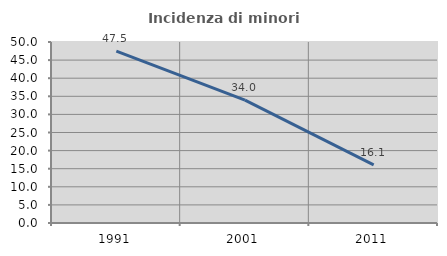
| Category | Incidenza di minori stranieri |
|---|---|
| 1991.0 | 47.5 |
| 2001.0 | 33.962 |
| 2011.0 | 16.055 |